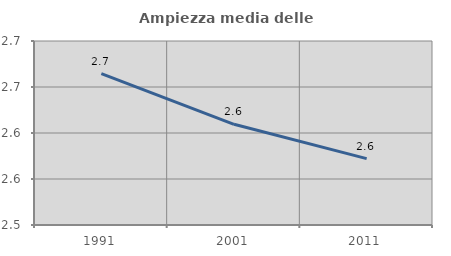
| Category | Ampiezza media delle famiglie |
|---|---|
| 1991.0 | 2.665 |
| 2001.0 | 2.609 |
| 2011.0 | 2.572 |